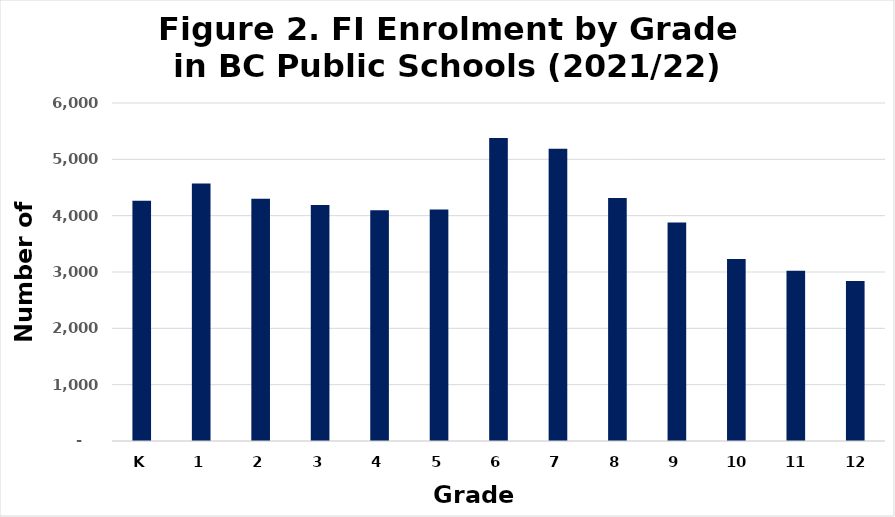
| Category | Number of Students |
|---|---|
| K | 4264 |
| 1 | 4570 |
| 2 | 4300 |
| 3 | 4190 |
| 4 | 4097 |
| 5 | 4111 |
| 6 | 5379 |
| 7 | 5186 |
| 8 | 4312 |
| 9 | 3879 |
| 10 | 3231 |
| 11 | 3020 |
| 12 | 2839 |